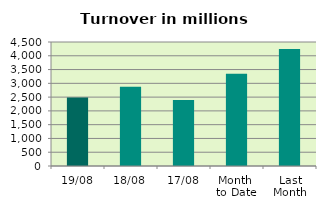
| Category | Series 0 |
|---|---|
| 19/08 | 2488.036 |
| 18/08 | 2877.159 |
| 17/08 | 2399.537 |
| Month 
to Date | 3349.101 |
| Last
Month | 4246.231 |